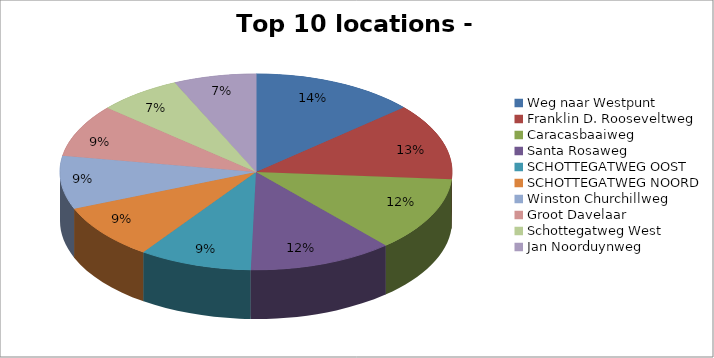
| Category | Series 0 |
|---|---|
| Weg naar Westpunt | 546 |
| Franklin D. Rooseveltweg | 507 |
| Caracasbaaiweg | 496 |
| Santa Rosaweg | 479 |
| SCHOTTEGATWEG OOST | 374 |
| SCHOTTEGATWEG NOORD | 368 |
| Winston Churchillweg | 352 |
| Groot Davelaar | 350 |
| Schottegatweg West | 277 |
| Jan Noorduynweg | 273 |